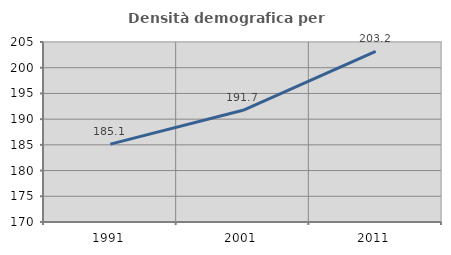
| Category | Densità demografica |
|---|---|
| 1991.0 | 185.144 |
| 2001.0 | 191.715 |
| 2011.0 | 203.17 |